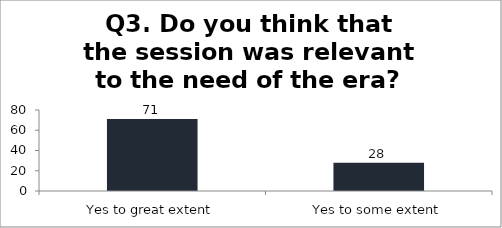
| Category | Q3. Do you think that the session was relevant to the need of the era? |
|---|---|
| Yes to great extent | 71 |
| Yes to some extent | 28 |